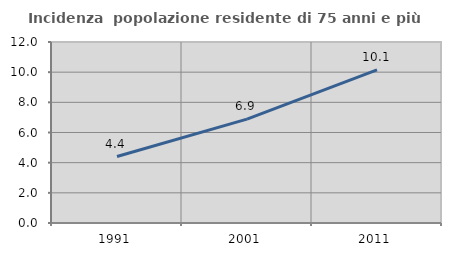
| Category | Incidenza  popolazione residente di 75 anni e più |
|---|---|
| 1991.0 | 4.407 |
| 2001.0 | 6.891 |
| 2011.0 | 10.146 |